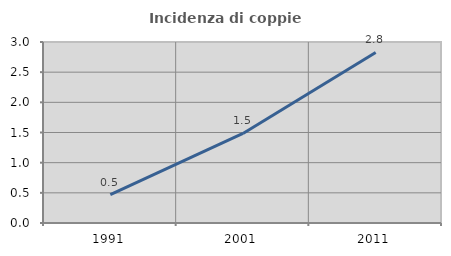
| Category | Incidenza di coppie miste |
|---|---|
| 1991.0 | 0.471 |
| 2001.0 | 1.484 |
| 2011.0 | 2.827 |